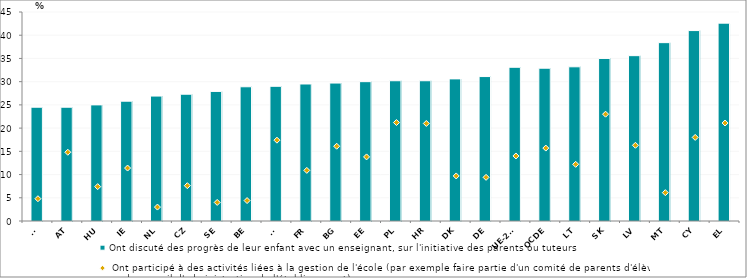
| Category | Ont discuté des progrès de leur enfant avec un enseignant, sur l'initiative des parents ou tuteurs |
|---|---|
| FI | 24.5 |
| AT | 24.5 |
| HU | 25 |
| IE | 25.8 |
| NL | 26.9 |
| CZ | 27.3 |
| SE | 27.9 |
| BE | 28.9 |
| SI | 29 |
| FR | 29.5 |
| BG | 29.7 |
| EE | 30 |
| PL | 30.2 |
| HR | 30.2 |
| DK | 30.6 |
| DE | 31.1 |
| UE-26* | 33.1 |
| OCDE | 32.9 |
| LT | 33.2 |
| SK | 35 |
| LV | 35.6 |
| MT | 38.4 |
| CY | 41 |
| EL | 42.6 |